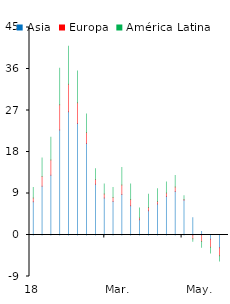
| Category | Asia | Europa | América Latina |
|---|---|---|---|
| 2018-01-03 | 7.235 | 0.79 | 2.27 |
| 2018-01-10 | 10.582 | 2.127 | 3.985 |
| 2018-01-17 | 12.969 | 3.278 | 4.948 |
| 2018-01-24 | 22.774 | 5.487 | 7.903 |
| 2018-01-31 | 26.727 | 5.953 | 8.252 |
| 2018-02-07 | 24.163 | 4.529 | 6.848 |
| 2018-02-14 | 19.839 | 2.399 | 3.99 |
| 2018-02-21 | 10.981 | 1.061 | 2.342 |
| 2018-02-28 | 8.013 | 0.858 | 2.211 |
| 2018-03-07 | 7.267 | 0.879 | 2.133 |
| 2018-03-14 | 8.784 | 2.058 | 3.821 |
| 2018-03-21 | 6.363 | 1.317 | 3.405 |
| 2018-03-28 | 3.323 | 0.353 | 2.205 |
| 2018-04-04 | 5.277 | 0.71 | 2.87 |
| 2018-04-11 | 6.708 | 0.563 | 2.735 |
| 2018-04-18 | 8.372 | 0.753 | 2.388 |
| 2018-04-25 | 9.435 | 0.966 | 2.482 |
| 2018-05-02 | 7.543 | 0.171 | 0.821 |
| 2018-05-09 | 3.751 | -0.839 | -0.534 |
| 2018-05-16 | 0.738 | -1.397 | -1.242 |
| 2018-05-23 | -0.896 | -1.745 | -1.242 |
| 2018-05-30 | -2.748 | -1.746 | -1.137 |
| 2018-06-06 | -2.264 | -1.472 | -0.78 |